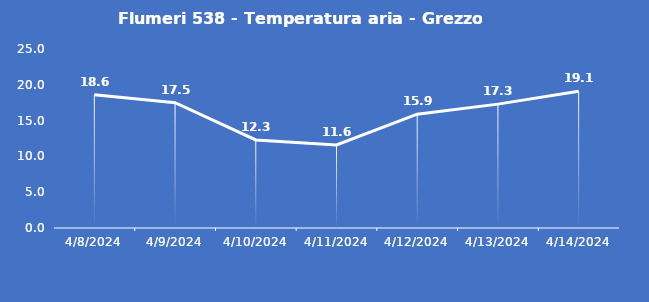
| Category | Flumeri 538 - Temperatura aria - Grezzo (°C) |
|---|---|
| 4/8/24 | 18.6 |
| 4/9/24 | 17.5 |
| 4/10/24 | 12.3 |
| 4/11/24 | 11.6 |
| 4/12/24 | 15.9 |
| 4/13/24 | 17.3 |
| 4/14/24 | 19.1 |